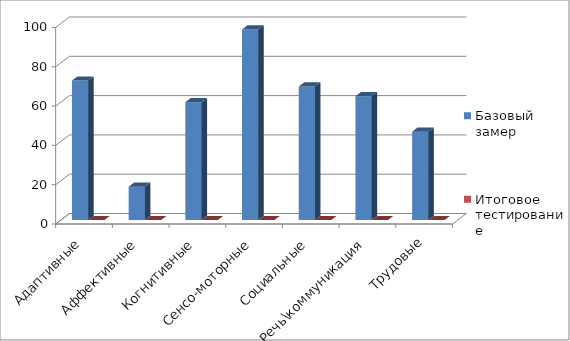
| Category | Базовый замер | Итоговое тестирование |
|---|---|---|
| Адаптивные | 71 | 0 |
| Аффективные | 17 | 0 |
| Когнитивные | 60 | 0 |
| Сенсо-моторные | 97 | 0 |
| Социальные | 68 | 0 |
| Речь\коммуникация | 63 | 0 |
| Трудовые | 45 | 0 |